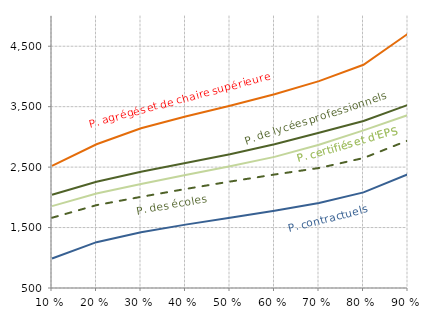
| Category | P. des écoles | P. agrégés et de chaire supérieure | P. certifiés et d'EPS | P. de lycées professionnels | P. contractuels |
|---|---|---|---|---|---|
| 0.1 | 1662.017 | 2521.667 | 1854.717 | 2042.717 | 988.017 |
| 0.2 | 1870.8 | 2878.3 | 2063.883 | 2257.046 | 1258.181 |
| 0.3 | 2008.1 | 3142.217 | 2220.217 | 2423.717 | 1420.8 |
| 0.4 | 2137.883 | 3335.883 | 2369.217 | 2566.583 | 1548.417 |
| 0.5 | 2260.75 | 3513.617 | 2512.533 | 2713.533 | 1664.05 |
| 0.6 | 2377.383 | 3706.8 | 2669.417 | 2878.883 | 1779.698 |
| 0.7 | 2485.217 | 3922.55 | 2871.217 | 3068.183 | 1905.717 |
| 0.8 | 2649.75 | 4192.633 | 3108.05 | 3263.8 | 2082.167 |
| 0.9 | 2941.3 | 4708 | 3362.433 | 3528.633 | 2382.967 |